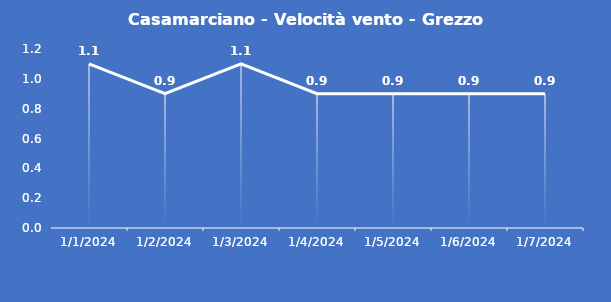
| Category | Casamarciano - Velocità vento - Grezzo (m/s) |
|---|---|
| 1/1/24 | 1.1 |
| 1/2/24 | 0.9 |
| 1/3/24 | 1.1 |
| 1/4/24 | 0.9 |
| 1/5/24 | 0.9 |
| 1/6/24 | 0.9 |
| 1/7/24 | 0.9 |